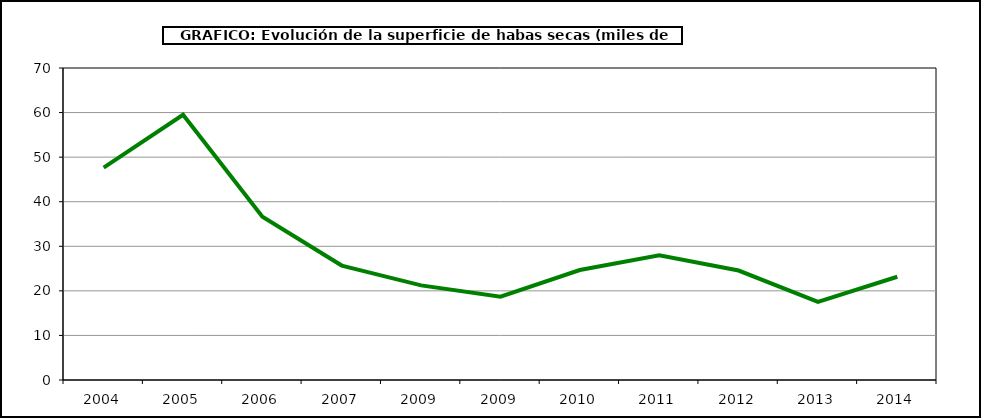
| Category | Superficie |
|---|---|
| 2004.0 | 47.661 |
| 2005.0 | 59.515 |
| 2006.0 | 36.641 |
| 2007.0 | 25.672 |
| 2009.0 | 21.228 |
| 2009.0 | 18.704 |
| 2010.0 | 24.675 |
| 2011.0 | 27.957 |
| 2012.0 | 24.564 |
| 2013.0 | 17.542 |
| 2014.0 | 23.165 |